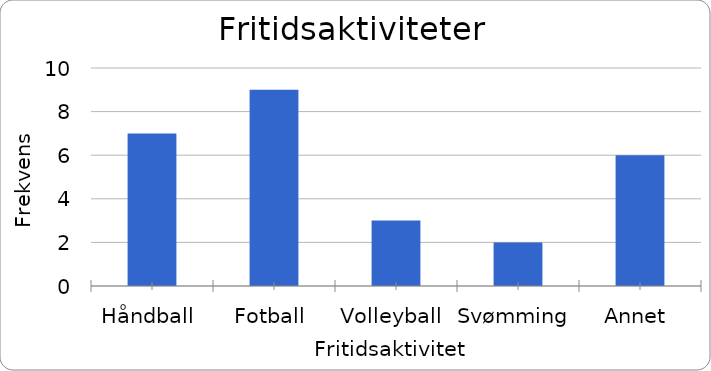
| Category | Frekvens |
|---|---|
| Håndball | 7 |
| Fotball | 9 |
| Volleyball | 3 |
| Svømming | 2 |
| Annet | 6 |